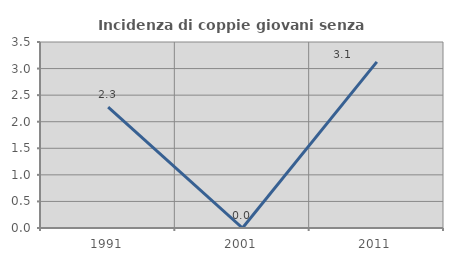
| Category | Incidenza di coppie giovani senza figli |
|---|---|
| 1991.0 | 2.273 |
| 2001.0 | 0 |
| 2011.0 | 3.125 |